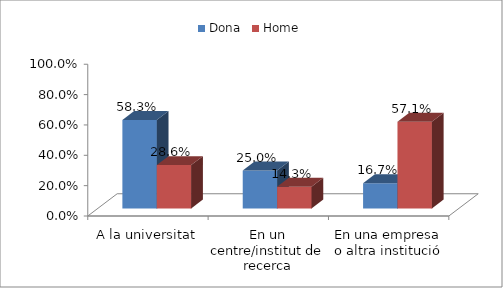
| Category | Dona | Home |
|---|---|---|
| A la universitat | 0.583 | 0.286 |
| En un centre/institut de recerca | 0.25 | 0.143 |
| En una empresa o altra institució | 0.167 | 0.571 |